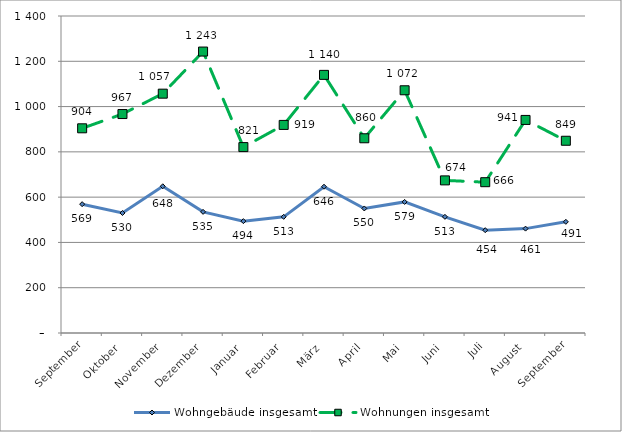
| Category | Wohngebäude insgesamt | Wohnungen insgesamt |
|---|---|---|
| September | 569 | 904 |
| Oktober | 530 | 967 |
| November | 648 | 1057 |
| Dezember | 535 | 1243 |
| Januar | 494 | 821 |
| Februar | 513 | 919 |
| März | 646 | 1140 |
| April | 550 | 860 |
| Mai | 579 | 1072 |
| Juni | 513 | 674 |
| Juli | 454 | 666 |
| August | 461 | 941 |
| September | 491 | 849 |